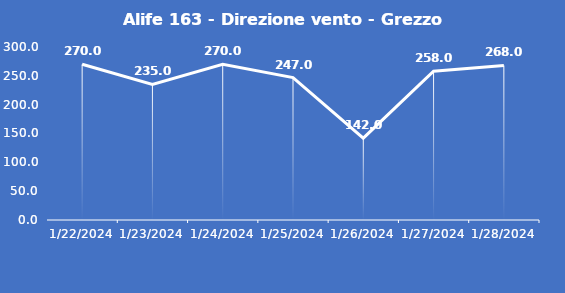
| Category | Alife 163 - Direzione vento - Grezzo (°N) |
|---|---|
| 1/22/24 | 270 |
| 1/23/24 | 235 |
| 1/24/24 | 270 |
| 1/25/24 | 247 |
| 1/26/24 | 142 |
| 1/27/24 | 258 |
| 1/28/24 | 268 |